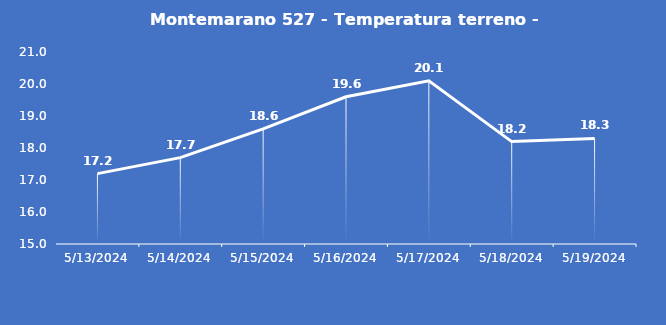
| Category | Montemarano 527 - Temperatura terreno - Grezzo (°C) |
|---|---|
| 5/13/24 | 17.2 |
| 5/14/24 | 17.7 |
| 5/15/24 | 18.6 |
| 5/16/24 | 19.6 |
| 5/17/24 | 20.1 |
| 5/18/24 | 18.2 |
| 5/19/24 | 18.3 |